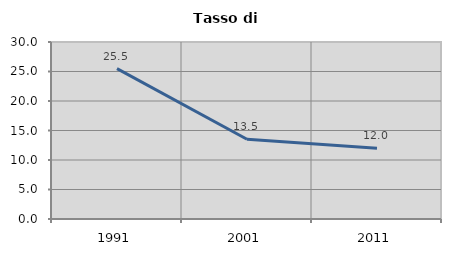
| Category | Tasso di disoccupazione   |
|---|---|
| 1991.0 | 25.497 |
| 2001.0 | 13.524 |
| 2011.0 | 11.993 |